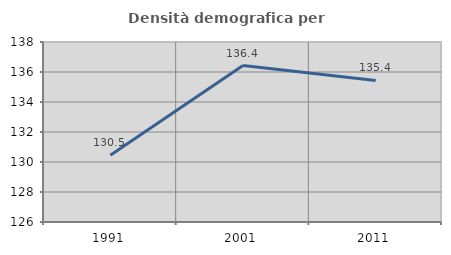
| Category | Densità demografica |
|---|---|
| 1991.0 | 130.455 |
| 2001.0 | 136.43 |
| 2011.0 | 135.434 |